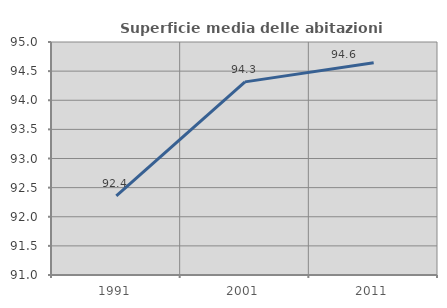
| Category | Superficie media delle abitazioni occupate |
|---|---|
| 1991.0 | 92.357 |
| 2001.0 | 94.315 |
| 2011.0 | 94.642 |